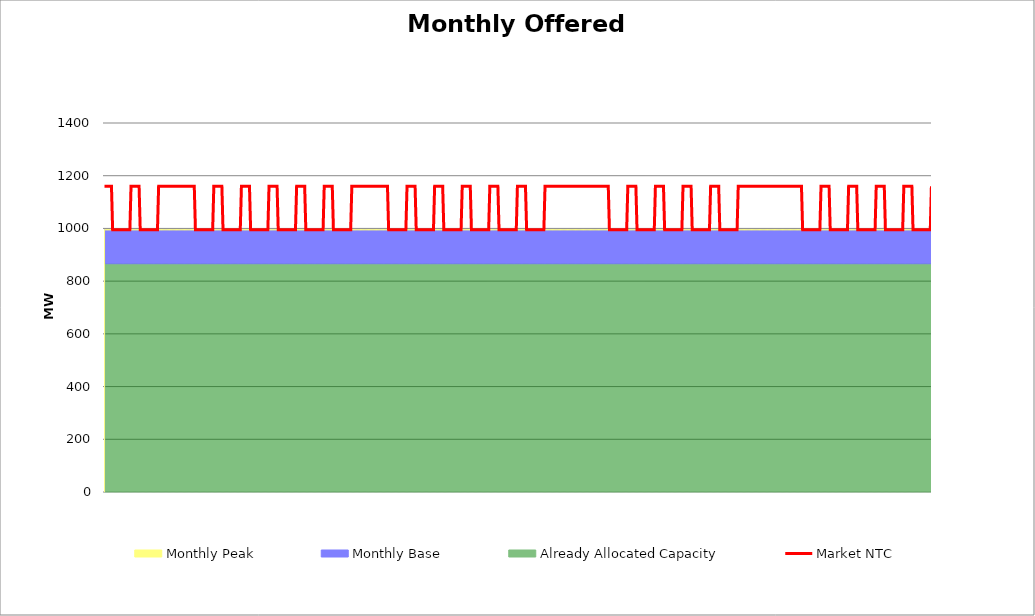
| Category | Market NTC |
|---|---|
| 0 | 1160 |
| 1 | 1160 |
| 2 | 1160 |
| 3 | 1160 |
| 4 | 1160 |
| 5 | 1160 |
| 6 | 1160 |
| 7 | 995 |
| 8 | 995 |
| 9 | 995 |
| 10 | 995 |
| 11 | 995 |
| 12 | 995 |
| 13 | 995 |
| 14 | 995 |
| 15 | 995 |
| 16 | 995 |
| 17 | 995 |
| 18 | 995 |
| 19 | 995 |
| 20 | 995 |
| 21 | 995 |
| 22 | 995 |
| 23 | 1160 |
| 24 | 1160 |
| 25 | 1160 |
| 26 | 1160 |
| 27 | 1160 |
| 28 | 1160 |
| 29 | 1160 |
| 30 | 1160 |
| 31 | 995 |
| 32 | 995 |
| 33 | 995 |
| 34 | 995 |
| 35 | 995 |
| 36 | 995 |
| 37 | 995 |
| 38 | 995 |
| 39 | 995 |
| 40 | 995 |
| 41 | 995 |
| 42 | 995 |
| 43 | 995 |
| 44 | 995 |
| 45 | 995 |
| 46 | 995 |
| 47 | 1160 |
| 48 | 1160 |
| 49 | 1160 |
| 50 | 1160 |
| 51 | 1160 |
| 52 | 1160 |
| 53 | 1160 |
| 54 | 1160 |
| 55 | 1160 |
| 56 | 1160 |
| 57 | 1160 |
| 58 | 1160 |
| 59 | 1160 |
| 60 | 1160 |
| 61 | 1160 |
| 62 | 1160 |
| 63 | 1160 |
| 64 | 1160 |
| 65 | 1160 |
| 66 | 1160 |
| 67 | 1160 |
| 68 | 1160 |
| 69 | 1160 |
| 70 | 1160 |
| 71 | 1160 |
| 72 | 1160 |
| 73 | 1160 |
| 74 | 1160 |
| 75 | 1160 |
| 76 | 1160 |
| 77 | 1160 |
| 78 | 1160 |
| 79 | 995 |
| 80 | 995 |
| 81 | 995 |
| 82 | 995 |
| 83 | 995 |
| 84 | 995 |
| 85 | 995 |
| 86 | 995 |
| 87 | 995 |
| 88 | 995 |
| 89 | 995 |
| 90 | 995 |
| 91 | 995 |
| 92 | 995 |
| 93 | 995 |
| 94 | 995 |
| 95 | 1160 |
| 96 | 1160 |
| 97 | 1160 |
| 98 | 1160 |
| 99 | 1160 |
| 100 | 1160 |
| 101 | 1160 |
| 102 | 1160 |
| 103 | 995 |
| 104 | 995 |
| 105 | 995 |
| 106 | 995 |
| 107 | 995 |
| 108 | 995 |
| 109 | 995 |
| 110 | 995 |
| 111 | 995 |
| 112 | 995 |
| 113 | 995 |
| 114 | 995 |
| 115 | 995 |
| 116 | 995 |
| 117 | 995 |
| 118 | 995 |
| 119 | 1160 |
| 120 | 1160 |
| 121 | 1160 |
| 122 | 1160 |
| 123 | 1160 |
| 124 | 1160 |
| 125 | 1160 |
| 126 | 1160 |
| 127 | 995 |
| 128 | 995 |
| 129 | 995 |
| 130 | 995 |
| 131 | 995 |
| 132 | 995 |
| 133 | 995 |
| 134 | 995 |
| 135 | 995 |
| 136 | 995 |
| 137 | 995 |
| 138 | 995 |
| 139 | 995 |
| 140 | 995 |
| 141 | 995 |
| 142 | 995 |
| 143 | 1160 |
| 144 | 1160 |
| 145 | 1160 |
| 146 | 1160 |
| 147 | 1160 |
| 148 | 1160 |
| 149 | 1160 |
| 150 | 1160 |
| 151 | 995 |
| 152 | 995 |
| 153 | 995 |
| 154 | 995 |
| 155 | 995 |
| 156 | 995 |
| 157 | 995 |
| 158 | 995 |
| 159 | 995 |
| 160 | 995 |
| 161 | 995 |
| 162 | 995 |
| 163 | 995 |
| 164 | 995 |
| 165 | 995 |
| 166 | 995 |
| 167 | 1160 |
| 168 | 1160 |
| 169 | 1160 |
| 170 | 1160 |
| 171 | 1160 |
| 172 | 1160 |
| 173 | 1160 |
| 174 | 1160 |
| 175 | 995 |
| 176 | 995 |
| 177 | 995 |
| 178 | 995 |
| 179 | 995 |
| 180 | 995 |
| 181 | 995 |
| 182 | 995 |
| 183 | 995 |
| 184 | 995 |
| 185 | 995 |
| 186 | 995 |
| 187 | 995 |
| 188 | 995 |
| 189 | 995 |
| 190 | 995 |
| 191 | 1160 |
| 192 | 1160 |
| 193 | 1160 |
| 194 | 1160 |
| 195 | 1160 |
| 196 | 1160 |
| 197 | 1160 |
| 198 | 1160 |
| 199 | 995 |
| 200 | 995 |
| 201 | 995 |
| 202 | 995 |
| 203 | 995 |
| 204 | 995 |
| 205 | 995 |
| 206 | 995 |
| 207 | 995 |
| 208 | 995 |
| 209 | 995 |
| 210 | 995 |
| 211 | 995 |
| 212 | 995 |
| 213 | 995 |
| 214 | 995 |
| 215 | 1160 |
| 216 | 1160 |
| 217 | 1160 |
| 218 | 1160 |
| 219 | 1160 |
| 220 | 1160 |
| 221 | 1160 |
| 222 | 1160 |
| 223 | 1160 |
| 224 | 1160 |
| 225 | 1160 |
| 226 | 1160 |
| 227 | 1160 |
| 228 | 1160 |
| 229 | 1160 |
| 230 | 1160 |
| 231 | 1160 |
| 232 | 1160 |
| 233 | 1160 |
| 234 | 1160 |
| 235 | 1160 |
| 236 | 1160 |
| 237 | 1160 |
| 238 | 1160 |
| 239 | 1160 |
| 240 | 1160 |
| 241 | 1160 |
| 242 | 1160 |
| 243 | 1160 |
| 244 | 1160 |
| 245 | 1160 |
| 246 | 1160 |
| 247 | 995 |
| 248 | 995 |
| 249 | 995 |
| 250 | 995 |
| 251 | 995 |
| 252 | 995 |
| 253 | 995 |
| 254 | 995 |
| 255 | 995 |
| 256 | 995 |
| 257 | 995 |
| 258 | 995 |
| 259 | 995 |
| 260 | 995 |
| 261 | 995 |
| 262 | 995 |
| 263 | 1160 |
| 264 | 1160 |
| 265 | 1160 |
| 266 | 1160 |
| 267 | 1160 |
| 268 | 1160 |
| 269 | 1160 |
| 270 | 1160 |
| 271 | 995 |
| 272 | 995 |
| 273 | 995 |
| 274 | 995 |
| 275 | 995 |
| 276 | 995 |
| 277 | 995 |
| 278 | 995 |
| 279 | 995 |
| 280 | 995 |
| 281 | 995 |
| 282 | 995 |
| 283 | 995 |
| 284 | 995 |
| 285 | 995 |
| 286 | 995 |
| 287 | 1160 |
| 288 | 1160 |
| 289 | 1160 |
| 290 | 1160 |
| 291 | 1160 |
| 292 | 1160 |
| 293 | 1160 |
| 294 | 1160 |
| 295 | 995 |
| 296 | 995 |
| 297 | 995 |
| 298 | 995 |
| 299 | 995 |
| 300 | 995 |
| 301 | 995 |
| 302 | 995 |
| 303 | 995 |
| 304 | 995 |
| 305 | 995 |
| 306 | 995 |
| 307 | 995 |
| 308 | 995 |
| 309 | 995 |
| 310 | 995 |
| 311 | 1160 |
| 312 | 1160 |
| 313 | 1160 |
| 314 | 1160 |
| 315 | 1160 |
| 316 | 1160 |
| 317 | 1160 |
| 318 | 1160 |
| 319 | 995 |
| 320 | 995 |
| 321 | 995 |
| 322 | 995 |
| 323 | 995 |
| 324 | 995 |
| 325 | 995 |
| 326 | 995 |
| 327 | 995 |
| 328 | 995 |
| 329 | 995 |
| 330 | 995 |
| 331 | 995 |
| 332 | 995 |
| 333 | 995 |
| 334 | 995 |
| 335 | 1160 |
| 336 | 1160 |
| 337 | 1160 |
| 338 | 1160 |
| 339 | 1160 |
| 340 | 1160 |
| 341 | 1160 |
| 342 | 1160 |
| 343 | 995 |
| 344 | 995 |
| 345 | 995 |
| 346 | 995 |
| 347 | 995 |
| 348 | 995 |
| 349 | 995 |
| 350 | 995 |
| 351 | 995 |
| 352 | 995 |
| 353 | 995 |
| 354 | 995 |
| 355 | 995 |
| 356 | 995 |
| 357 | 995 |
| 358 | 995 |
| 359 | 1160 |
| 360 | 1160 |
| 361 | 1160 |
| 362 | 1160 |
| 363 | 1160 |
| 364 | 1160 |
| 365 | 1160 |
| 366 | 1160 |
| 367 | 995 |
| 368 | 995 |
| 369 | 995 |
| 370 | 995 |
| 371 | 995 |
| 372 | 995 |
| 373 | 995 |
| 374 | 995 |
| 375 | 995 |
| 376 | 995 |
| 377 | 995 |
| 378 | 995 |
| 379 | 995 |
| 380 | 995 |
| 381 | 995 |
| 382 | 995 |
| 383 | 1160 |
| 384 | 1160 |
| 385 | 1160 |
| 386 | 1160 |
| 387 | 1160 |
| 388 | 1160 |
| 389 | 1160 |
| 390 | 1160 |
| 391 | 1160 |
| 392 | 1160 |
| 393 | 1160 |
| 394 | 1160 |
| 395 | 1160 |
| 396 | 1160 |
| 397 | 1160 |
| 398 | 1160 |
| 399 | 1160 |
| 400 | 1160 |
| 401 | 1160 |
| 402 | 1160 |
| 403 | 1160 |
| 404 | 1160 |
| 405 | 1160 |
| 406 | 1160 |
| 407 | 1160 |
| 408 | 1160 |
| 409 | 1160 |
| 410 | 1160 |
| 411 | 1160 |
| 412 | 1160 |
| 413 | 1160 |
| 414 | 1160 |
| 415 | 1160 |
| 416 | 1160 |
| 417 | 1160 |
| 418 | 1160 |
| 419 | 1160 |
| 420 | 1160 |
| 421 | 1160 |
| 422 | 1160 |
| 423 | 1160 |
| 424 | 1160 |
| 425 | 1160 |
| 426 | 1160 |
| 427 | 1160 |
| 428 | 1160 |
| 429 | 1160 |
| 430 | 1160 |
| 431 | 1160 |
| 432 | 1160 |
| 433 | 1160 |
| 434 | 1160 |
| 435 | 1160 |
| 436 | 1160 |
| 437 | 1160 |
| 438 | 1160 |
| 439 | 995 |
| 440 | 995 |
| 441 | 995 |
| 442 | 995 |
| 443 | 995 |
| 444 | 995 |
| 445 | 995 |
| 446 | 995 |
| 447 | 995 |
| 448 | 995 |
| 449 | 995 |
| 450 | 995 |
| 451 | 995 |
| 452 | 995 |
| 453 | 995 |
| 454 | 995 |
| 455 | 1160 |
| 456 | 1160 |
| 457 | 1160 |
| 458 | 1160 |
| 459 | 1160 |
| 460 | 1160 |
| 461 | 1160 |
| 462 | 1160 |
| 463 | 995 |
| 464 | 995 |
| 465 | 995 |
| 466 | 995 |
| 467 | 995 |
| 468 | 995 |
| 469 | 995 |
| 470 | 995 |
| 471 | 995 |
| 472 | 995 |
| 473 | 995 |
| 474 | 995 |
| 475 | 995 |
| 476 | 995 |
| 477 | 995 |
| 478 | 995 |
| 479 | 1160 |
| 480 | 1160 |
| 481 | 1160 |
| 482 | 1160 |
| 483 | 1160 |
| 484 | 1160 |
| 485 | 1160 |
| 486 | 1160 |
| 487 | 995 |
| 488 | 995 |
| 489 | 995 |
| 490 | 995 |
| 491 | 995 |
| 492 | 995 |
| 493 | 995 |
| 494 | 995 |
| 495 | 995 |
| 496 | 995 |
| 497 | 995 |
| 498 | 995 |
| 499 | 995 |
| 500 | 995 |
| 501 | 995 |
| 502 | 995 |
| 503 | 1160 |
| 504 | 1160 |
| 505 | 1160 |
| 506 | 1160 |
| 507 | 1160 |
| 508 | 1160 |
| 509 | 1160 |
| 510 | 1160 |
| 511 | 995 |
| 512 | 995 |
| 513 | 995 |
| 514 | 995 |
| 515 | 995 |
| 516 | 995 |
| 517 | 995 |
| 518 | 995 |
| 519 | 995 |
| 520 | 995 |
| 521 | 995 |
| 522 | 995 |
| 523 | 995 |
| 524 | 995 |
| 525 | 995 |
| 526 | 995 |
| 527 | 1160 |
| 528 | 1160 |
| 529 | 1160 |
| 530 | 1160 |
| 531 | 1160 |
| 532 | 1160 |
| 533 | 1160 |
| 534 | 1160 |
| 535 | 995 |
| 536 | 995 |
| 537 | 995 |
| 538 | 995 |
| 539 | 995 |
| 540 | 995 |
| 541 | 995 |
| 542 | 995 |
| 543 | 995 |
| 544 | 995 |
| 545 | 995 |
| 546 | 995 |
| 547 | 995 |
| 548 | 995 |
| 549 | 995 |
| 550 | 995 |
| 551 | 1160 |
| 552 | 1160 |
| 553 | 1160 |
| 554 | 1160 |
| 555 | 1160 |
| 556 | 1160 |
| 557 | 1160 |
| 558 | 1160 |
| 559 | 1160 |
| 560 | 1160 |
| 561 | 1160 |
| 562 | 1160 |
| 563 | 1160 |
| 564 | 1160 |
| 565 | 1160 |
| 566 | 1160 |
| 567 | 1160 |
| 568 | 1160 |
| 569 | 1160 |
| 570 | 1160 |
| 571 | 1160 |
| 572 | 1160 |
| 573 | 1160 |
| 574 | 1160 |
| 575 | 1160 |
| 576 | 1160 |
| 577 | 1160 |
| 578 | 1160 |
| 579 | 1160 |
| 580 | 1160 |
| 581 | 1160 |
| 582 | 1160 |
| 583 | 1160 |
| 584 | 1160 |
| 585 | 1160 |
| 586 | 1160 |
| 587 | 1160 |
| 588 | 1160 |
| 589 | 1160 |
| 590 | 1160 |
| 591 | 1160 |
| 592 | 1160 |
| 593 | 1160 |
| 594 | 1160 |
| 595 | 1160 |
| 596 | 1160 |
| 597 | 1160 |
| 598 | 1160 |
| 599 | 1160 |
| 600 | 1160 |
| 601 | 1160 |
| 602 | 1160 |
| 603 | 1160 |
| 604 | 1160 |
| 605 | 1160 |
| 606 | 1160 |
| 607 | 995 |
| 608 | 995 |
| 609 | 995 |
| 610 | 995 |
| 611 | 995 |
| 612 | 995 |
| 613 | 995 |
| 614 | 995 |
| 615 | 995 |
| 616 | 995 |
| 617 | 995 |
| 618 | 995 |
| 619 | 995 |
| 620 | 995 |
| 621 | 995 |
| 622 | 995 |
| 623 | 1160 |
| 624 | 1160 |
| 625 | 1160 |
| 626 | 1160 |
| 627 | 1160 |
| 628 | 1160 |
| 629 | 1160 |
| 630 | 1160 |
| 631 | 995 |
| 632 | 995 |
| 633 | 995 |
| 634 | 995 |
| 635 | 995 |
| 636 | 995 |
| 637 | 995 |
| 638 | 995 |
| 639 | 995 |
| 640 | 995 |
| 641 | 995 |
| 642 | 995 |
| 643 | 995 |
| 644 | 995 |
| 645 | 995 |
| 646 | 995 |
| 647 | 1160 |
| 648 | 1160 |
| 649 | 1160 |
| 650 | 1160 |
| 651 | 1160 |
| 652 | 1160 |
| 653 | 1160 |
| 654 | 1160 |
| 655 | 995 |
| 656 | 995 |
| 657 | 995 |
| 658 | 995 |
| 659 | 995 |
| 660 | 995 |
| 661 | 995 |
| 662 | 995 |
| 663 | 995 |
| 664 | 995 |
| 665 | 995 |
| 666 | 995 |
| 667 | 995 |
| 668 | 995 |
| 669 | 995 |
| 670 | 995 |
| 671 | 1160 |
| 672 | 1160 |
| 673 | 1160 |
| 674 | 1160 |
| 675 | 1160 |
| 676 | 1160 |
| 677 | 1160 |
| 678 | 1160 |
| 679 | 995 |
| 680 | 995 |
| 681 | 995 |
| 682 | 995 |
| 683 | 995 |
| 684 | 995 |
| 685 | 995 |
| 686 | 995 |
| 687 | 995 |
| 688 | 995 |
| 689 | 995 |
| 690 | 995 |
| 691 | 995 |
| 692 | 995 |
| 693 | 995 |
| 694 | 995 |
| 695 | 1160 |
| 696 | 1160 |
| 697 | 1160 |
| 698 | 1160 |
| 699 | 1160 |
| 700 | 1160 |
| 701 | 1160 |
| 702 | 1160 |
| 703 | 995 |
| 704 | 995 |
| 705 | 995 |
| 706 | 995 |
| 707 | 995 |
| 708 | 995 |
| 709 | 995 |
| 710 | 995 |
| 711 | 995 |
| 712 | 995 |
| 713 | 995 |
| 714 | 995 |
| 715 | 995 |
| 716 | 995 |
| 717 | 995 |
| 718 | 995 |
| 719 | 1160 |